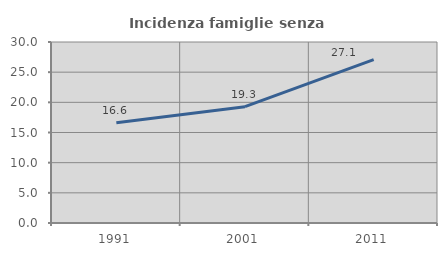
| Category | Incidenza famiglie senza nuclei |
|---|---|
| 1991.0 | 16.615 |
| 2001.0 | 19.274 |
| 2011.0 | 27.064 |